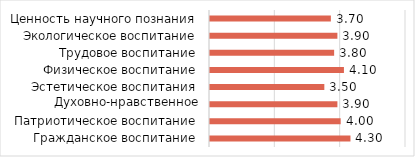
| Category | Средний
 балл |
|---|---|
| Гражданское воспитание | 4.3 |
| Патриотическое воспитание | 4 |
| Духовно-нравственное воспитание | 3.9 |
| Эстетическое воспитания | 3.5 |
| Физическое воспитание | 4.1 |
| Трудовое воспитание | 3.8 |
| Экологическое воспитание | 3.9 |
| Ценность научного познания | 3.7 |